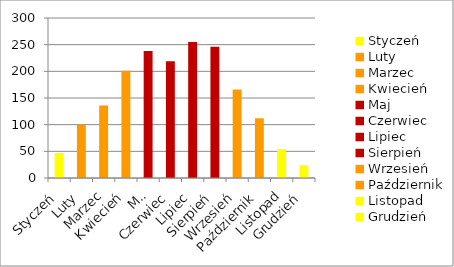
| Category | Zysk solarny [kWh] |
|---|---|
| Styczeń | 47 |
| Luty | 100 |
| Marzec | 136 |
| Kwiecień | 201 |
| Maj | 238 |
| Czerwiec | 219 |
| Lipiec | 255 |
| Sierpień | 246 |
| Wrzesień | 166 |
| Październik | 112 |
| Listopad | 54 |
| Grudzień | 24 |